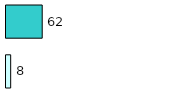
| Category | Series 0 | Series 1 |
|---|---|---|
| 0 | 8 | 62 |